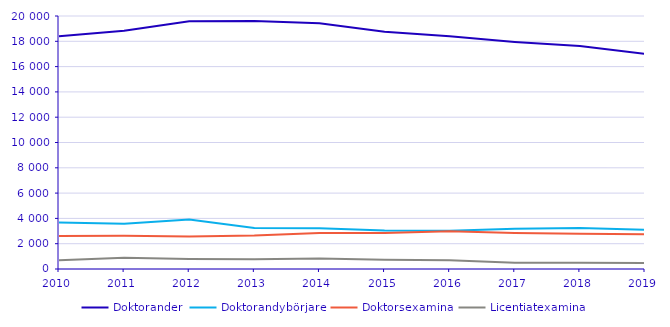
| Category | Doktorander | Doktorandybörjare | Doktorsexamina | Licentiatexamina |
|---|---|---|---|---|
| 2010.0 | 18395 | 3675 | 2615 | 682 |
| 2011.0 | 18831 | 3570 | 2619 | 886 |
| 2012.0 | 19581 | 3907 | 2578 | 787 |
| 2013.0 | 19600 | 3237 | 2650 | 771 |
| 2014.0 | 19422 | 3221 | 2851 | 838 |
| 2015.0 | 18762 | 3050 | 2854 | 731 |
| 2016.0 | 18392 | 3021 | 2990 | 689 |
| 2017.0 | 17954 | 3191 | 2838 | 501 |
| 2018.0 | 17619 | 3237 | 2789 | 502 |
| 2019.0 | 17003 | 3102 | 2750 | 483 |